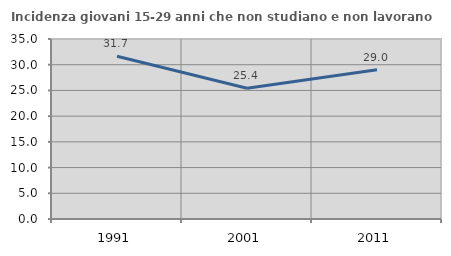
| Category | Incidenza giovani 15-29 anni che non studiano e non lavorano  |
|---|---|
| 1991.0 | 31.658 |
| 2001.0 | 25.439 |
| 2011.0 | 29.032 |